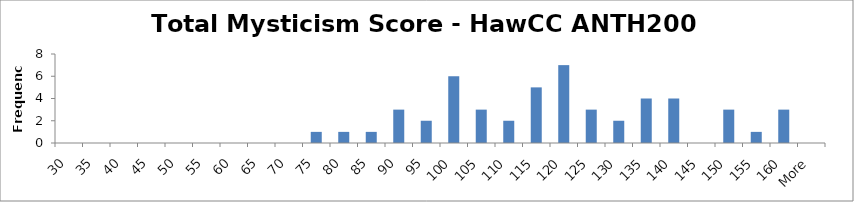
| Category | Frequency |
|---|---|
| 30 | 0 |
| 35 | 0 |
| 40 | 0 |
| 45 | 0 |
| 50 | 0 |
| 55 | 0 |
| 60 | 0 |
| 65 | 0 |
| 70 | 0 |
| 75 | 1 |
| 80 | 1 |
| 85 | 1 |
| 90 | 3 |
| 95 | 2 |
| 100 | 6 |
| 105 | 3 |
| 110 | 2 |
| 115 | 5 |
| 120 | 7 |
| 125 | 3 |
| 130 | 2 |
| 135 | 4 |
| 140 | 4 |
| 145 | 0 |
| 150 | 3 |
| 155 | 1 |
| 160 | 3 |
| More | 0 |